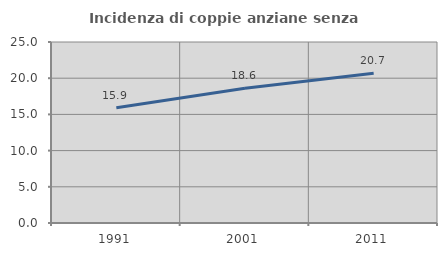
| Category | Incidenza di coppie anziane senza figli  |
|---|---|
| 1991.0 | 15.92 |
| 2001.0 | 18.623 |
| 2011.0 | 20.675 |